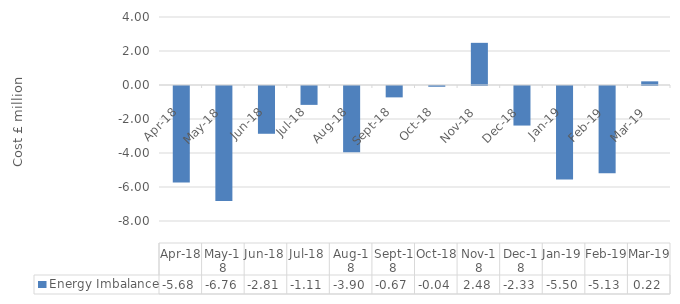
| Category | Energy Imbalance |
|---|---|
| 2018-04-01 | -5.679 |
| 2018-05-01 | -6.761 |
| 2018-06-01 | -2.81 |
| 2018-07-01 | -1.111 |
| 2018-08-01 | -3.902 |
| 2018-09-01 | -0.669 |
| 2018-10-01 | -0.045 |
| 2018-11-01 | 2.48 |
| 2018-12-01 | -2.327 |
| 2019-01-01 | -5.503 |
| 2019-02-01 | -5.125 |
| 2019-03-01 | 0.216 |